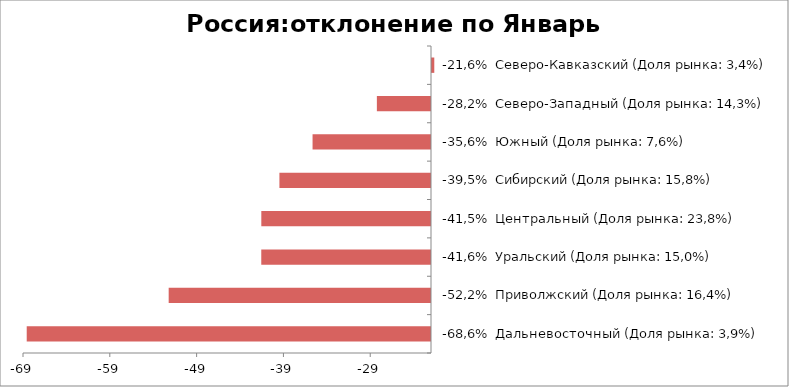
| Category | Россия:отклонение по Январь 2016-2015 |
|---|---|
| -68,6%  Дальневосточный (Доля рынка: 3,9%) | -68.571 |
| -52,2%  Приволжский (Доля рынка: 16,4%) | -52.218 |
| -41,6%  Уральский (Доля рынка: 15,0%) | -41.553 |
| -41,5%  Центральный (Доля рынка: 23,8%) | -41.547 |
| -39,5%  Сибирский (Доля рынка: 15,8%) | -39.462 |
| -35,6%  Южный (Доля рынка: 7,6%) | -35.644 |
| -28,2%  Северо-Западный (Доля рынка: 14,3%) | -28.235 |
| -21,6%  Северо-Кавказский (Доля рынка: 3,4%) | -21.622 |